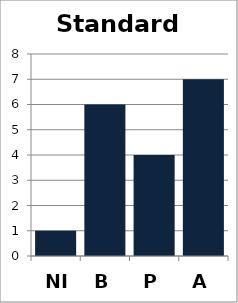
| Category | Standard 1 |
|---|---|
| NI | 1 |
| B | 6 |
| P | 4 |
| A | 7 |